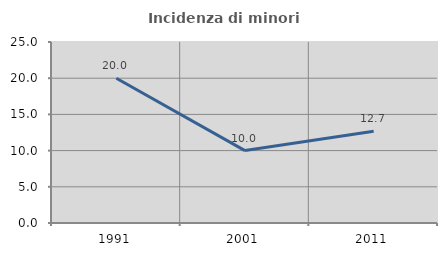
| Category | Incidenza di minori stranieri |
|---|---|
| 1991.0 | 20 |
| 2001.0 | 10 |
| 2011.0 | 12.658 |